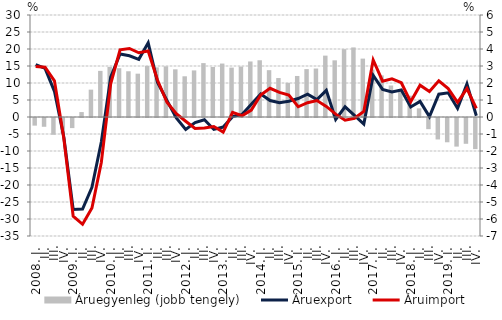
| Category | Áruegyenleg (jobb tengely) |
|---|---|
| 2008. I. | -0.45 |
|          II. | -0.517 |
|          III. | -0.987 |
|          IV. | -0.919 |
| 2009. I. | -0.594 |
|          II. | 0.29 |
|          III. | 1.61 |
|          IV. | 2.713 |
| 2010. I. | 2.948 |
|          II. | 2.87 |
|          III. | 2.691 |
|          IV. | 2.548 |
| 2011. I. | 3.006 |
|          II. | 2.919 |
|          III. | 2.981 |
|          IV. | 2.803 |
| 2012. I. | 2.395 |
|          II. | 2.741 |
|          III. | 3.17 |
|          IV. | 2.94 |
| 2013. I. | 3.144 |
| II. | 2.906 |
|          III. | 2.969 |
| IV. | 3.266 |
| 2014. I. | 3.337 |
| II. | 2.755 |
|          III. | 2.292 |
| IV. | 2.006 |
| 2015. I. | 2.414 |
| II. | 2.816 |
|          III. | 2.851 |
| IV. | 3.61 |
| 2016. I. | 3.333 |
| II. | 3.991 |
|          III. | 4.093 |
| IV. | 3.434 |
| 2017. I. | 2.793 |
| II. | 2.448 |
|          III. | 1.853 |
| IV. | 1.52 |
| 2018. I. | 1.254 |
| II. | 0.508 |
|          III. | -0.656 |
| IV. | -1.261 |